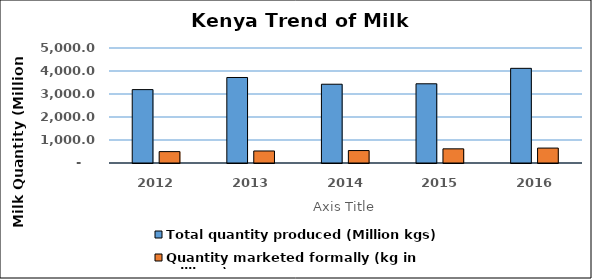
| Category | Total quantity produced (Million kgs) | Quantity marketed formally (kg in millions) |
|---|---|---|
| 2012.0 | 3190.7 | 495.2 |
| 2013.0 | 3717.8 | 523 |
| 2014.0 | 3425 | 541.3 |
| 2015.0 | 3444.2 | 615.9 |
| 2016.0 | 4115.5 | 648.2 |